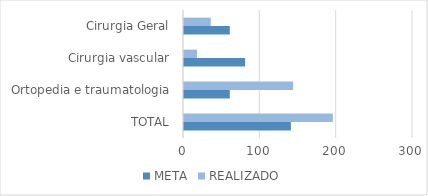
| Category | META | REALIZADO |
|---|---|---|
| TOTAL | 140 | 195 |
| Ortopedia e traumatologia | 60 | 143 |
| Cirurgia vascular | 80 | 17 |
| Cirurgia Geral | 60 | 35 |